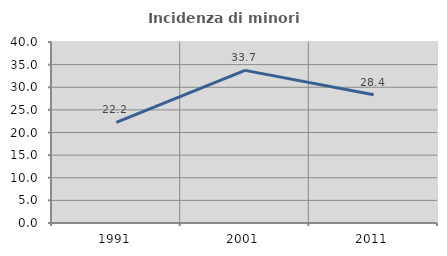
| Category | Incidenza di minori stranieri |
|---|---|
| 1991.0 | 22.222 |
| 2001.0 | 33.728 |
| 2011.0 | 28.361 |